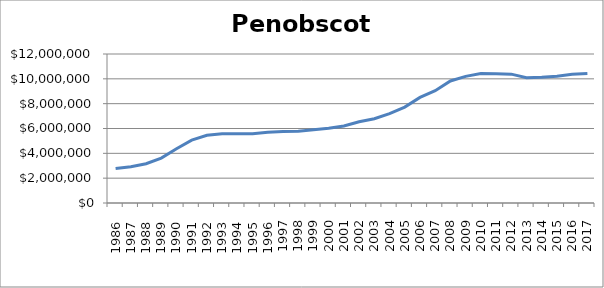
| Category | Penobscot (000s) |
|---|---|
|       1986 | 2775300 |
|       1987 | 2927550 |
|       1988 | 3162250 |
|       1989 | 3617750 |
|       1990 | 4368050 |
|       1991 | 5066200 |
|       1992 | 5450650 |
|       1993 | 5578950 |
|       1994 | 5585450 |
|       1995 | 5573800 |
|       1996 | 5700650 |
| 1997 | 5765350 |
| 1998 | 5780000 |
| 1999 | 5893750 |
| 2000 | 6018450 |
| 2001 | 6196250 |
| 2002 | 6546100 |
| 2003 | 6789050 |
| 2004 | 7201150 |
| 2005 | 7725450 |
| 2006 | 8507650 |
| 2007 | 9040950 |
| 2008 | 9827800 |
| 2009 | 10200700 |
| 2010 | 10423000 |
| 2011 | 10410100 |
| 2012 | 10379000 |
| 2013 | 10091500 |
| 2014 | 10128600 |
| 2015 | 10215600 |
| 2016 | 10359800 |
| 2017 | 10431700 |